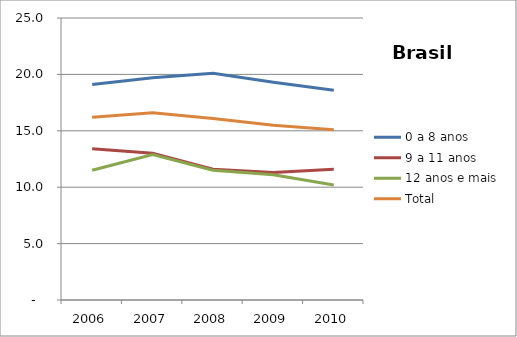
| Category | 0 a 8 anos | 9 a 11 anos | 12 anos e mais | Total |
|---|---|---|---|---|
| 2006.0 | 19.1 | 13.4 | 11.5 | 16.2 |
| 2007.0 | 19.7 | 13 | 12.9 | 16.6 |
| 2008.0 | 20.1 | 11.6 | 11.5 | 16.1 |
| 2009.0 | 19.3 | 11.3 | 11.1 | 15.5 |
| 2010.0 | 18.6 | 11.6 | 10.2 | 15.1 |